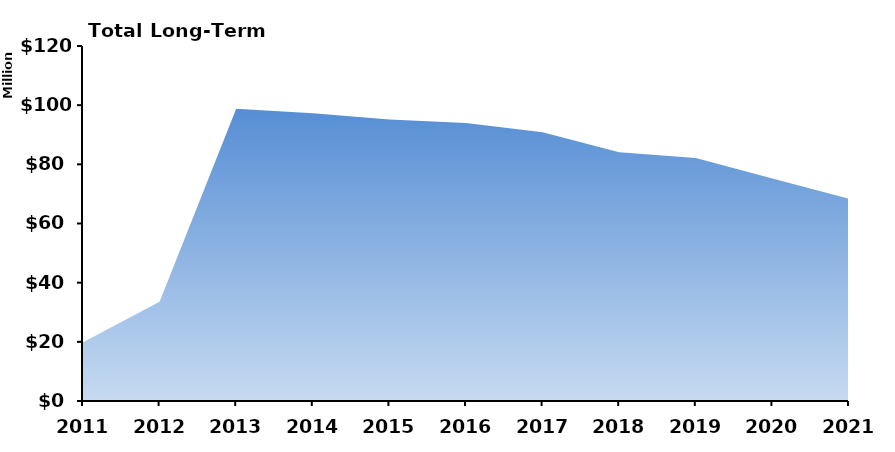
| Category | Bonds Outstanding |
|---|---|
| 2011.0 | 19861563 |
| 2012.0 | 33582640 |
| 2013.0 | 98795940 |
| 2014.0 | 97263380 |
| 2015.0 | 95117832 |
| 2016.0 | 93985957 |
| 2017.0 | 90804487 |
| 2018.0 | 84108108 |
| 2019.0 | 82181027 |
| 2020.0 | 75251735 |
| 2021.0 | 68374864 |